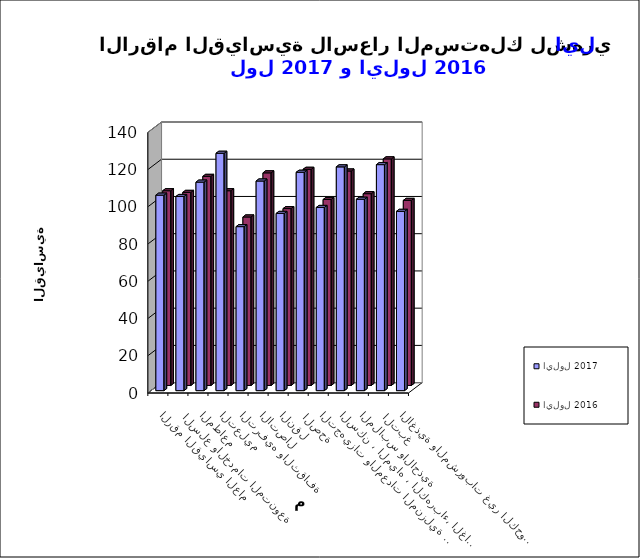
| Category | ايلول 2017      | ايلول 2016 |
|---|---|---|
| الاغذية والمشروبات غير الكحولية | 96.3 | 99.4 |
|  التبغ | 121.4 | 121.7 |
| الملابس والاحذية | 102.8 | 103 |
| السكن ، المياه ، الكهرباء، الغاز  | 120.2 | 115.2 |
| التجهيزات والمعدات المنزلية والصيانة | 98.4 | 99.9 |
|  الصحة | 117.3 | 116.1 |
| النقل | 95.2 | 95 |
| الاتصال | 112.6 | 114.2 |
| الترفيه والثقافة | 88.1 | 90.5 |
| التعليم | 127.5 | 104.6 |
| المطاعم  | 112 | 112.3 |
|  السلع والخدمات المتنوعة | 104.3 | 103.7 |
| الرقم القياسي العام | 105 | 104.6 |